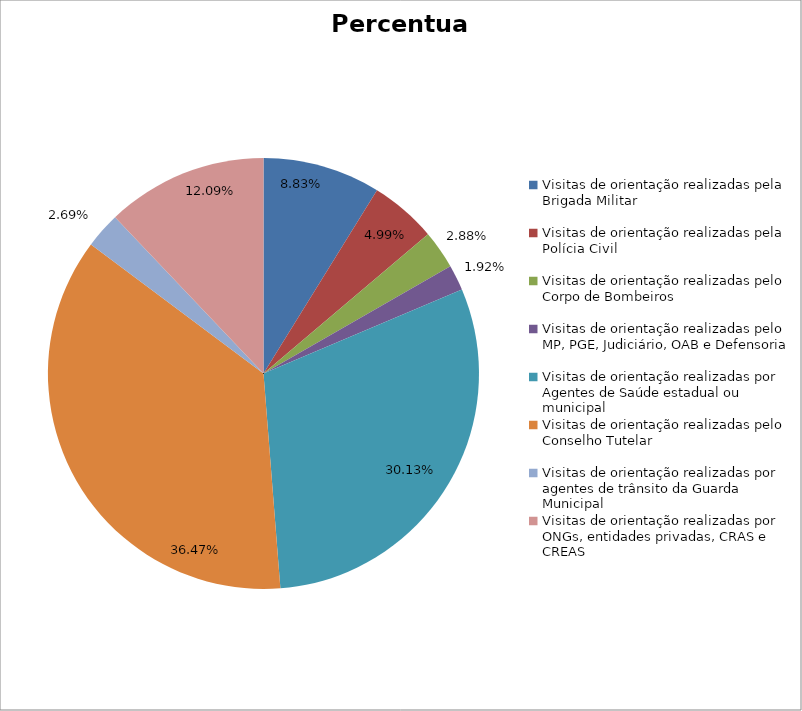
| Category | Percentual |
|---|---|
| Visitas de orientação realizadas pela Brigada Militar | 0.088 |
| Visitas de orientação realizadas pela Polícia Civil | 0.05 |
| Visitas de orientação realizadas pelo Corpo de Bombeiros | 0.029 |
| Visitas de orientação realizadas pelo MP, PGE, Judiciário, OAB e Defensoria | 0.019 |
| Visitas de orientação realizadas por Agentes de Saúde estadual ou municipal | 0.301 |
| Visitas de orientação realizadas pelo Conselho Tutelar | 0.365 |
| Visitas de orientação realizadas por agentes de trânsito da Guarda Municipal | 0.027 |
| Visitas de orientação realizadas por ONGs, entidades privadas, CRAS e CREAS | 0.121 |